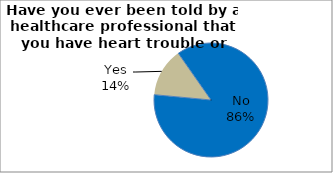
| Category | Series 0 |
|---|---|
| No | 86.208 |
| Yes | 13.792 |